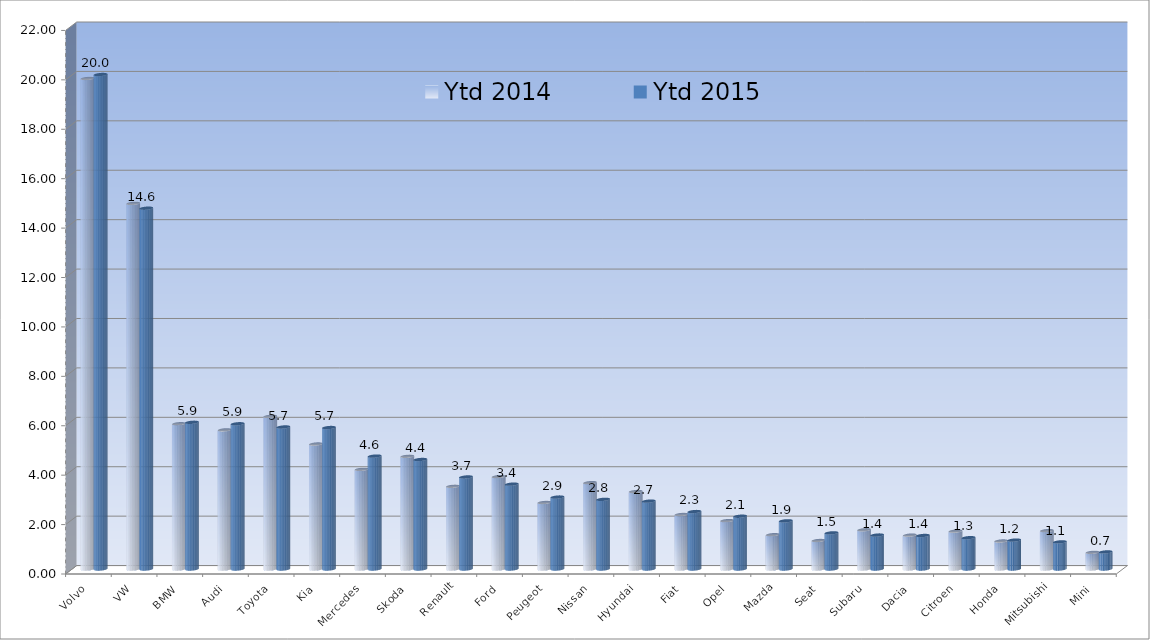
| Category | Ytd 2014 | Ytd 2015 |
|---|---|---|
| Volvo | 19.854 | 20.014 |
| VW | 14.798 | 14.603 |
| BMW | 5.88 | 5.937 |
| Audi | 5.631 | 5.878 |
| Toyota | 6.179 | 5.748 |
| Kia | 5.059 | 5.725 |
| Mercedes | 4.034 | 4.571 |
| Skoda | 4.561 | 4.432 |
| Renault | 3.347 | 3.725 |
| Ford | 3.739 | 3.434 |
| Peugeot | 2.692 | 2.912 |
| Nissan | 3.495 | 2.819 |
| Hyundai | 3.135 | 2.747 |
| Fiat | 2.206 | 2.325 |
| Opel | 1.958 | 2.136 |
| Mazda | 1.389 | 1.949 |
| Seat | 1.154 | 1.462 |
| Subaru | 1.586 | 1.374 |
| Dacia | 1.37 | 1.356 |
| Citroen | 1.532 | 1.267 |
| Honda | 1.133 | 1.17 |
| Mitsubishi | 1.553 | 1.098 |
| Mini | 0.674 | 0.691 |